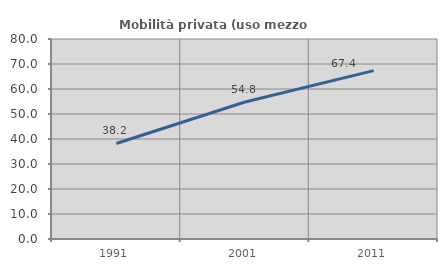
| Category | Mobilità privata (uso mezzo privato) |
|---|---|
| 1991.0 | 38.219 |
| 2001.0 | 54.799 |
| 2011.0 | 67.366 |